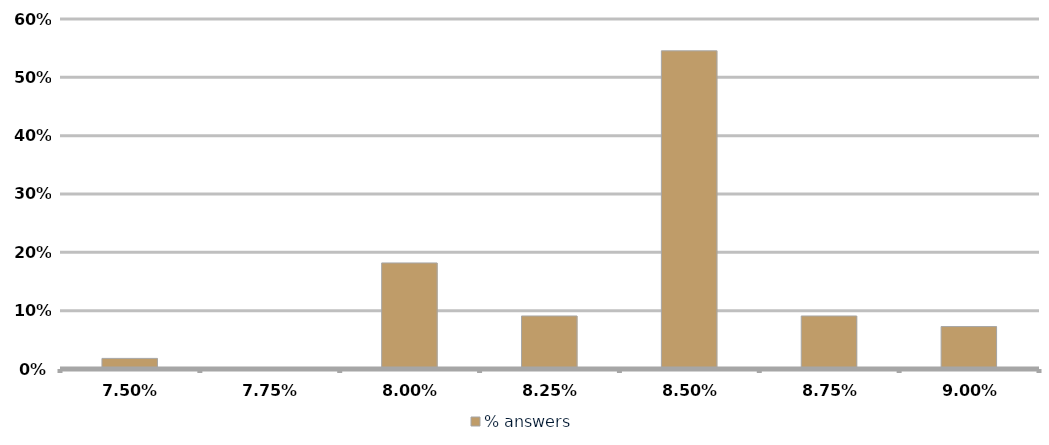
| Category | % answers |
|---|---|
| 0.075 | 0.018 |
| 0.0775 | 0 |
| 0.08 | 0.182 |
| 0.0825 | 0.091 |
| 0.085 | 0.545 |
| 0.08750000000000001 | 0.091 |
| 0.09000000000000001 | 0.073 |